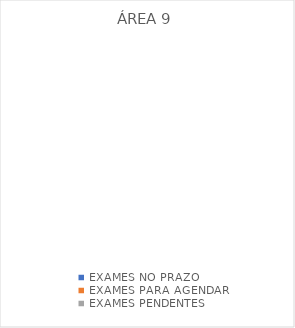
| Category | ÁREA 9 |
|---|---|
| EXAMES NO PRAZO | 0 |
| EXAMES PARA AGENDAR | 0 |
| EXAMES PENDENTES | 0 |